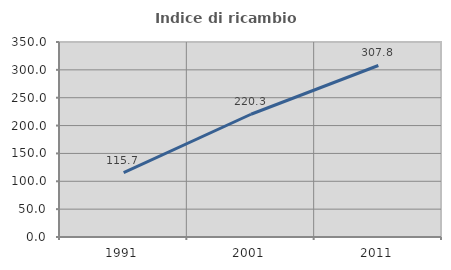
| Category | Indice di ricambio occupazionale  |
|---|---|
| 1991.0 | 115.73 |
| 2001.0 | 220.312 |
| 2011.0 | 307.843 |